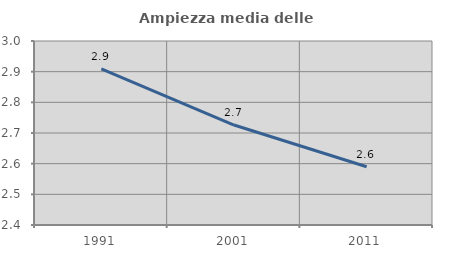
| Category | Ampiezza media delle famiglie |
|---|---|
| 1991.0 | 2.909 |
| 2001.0 | 2.726 |
| 2011.0 | 2.59 |